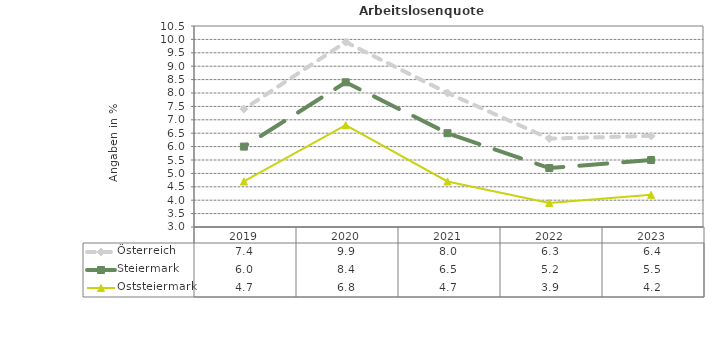
| Category | Österreich | Steiermark | Oststeiermark |
|---|---|---|---|
| 2023.0 | 6.4 | 5.5 | 4.2 |
| 2022.0 | 6.3 | 5.2 | 3.9 |
| 2021.0 | 8 | 6.5 | 4.7 |
| 2020.0 | 9.9 | 8.4 | 6.8 |
| 2019.0 | 7.4 | 6 | 4.7 |